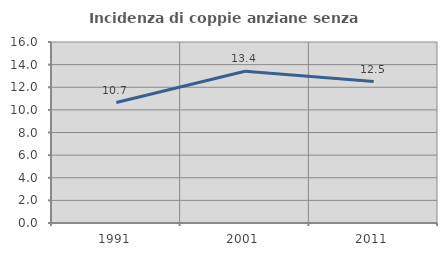
| Category | Incidenza di coppie anziane senza figli  |
|---|---|
| 1991.0 | 10.651 |
| 2001.0 | 13.415 |
| 2011.0 | 12.5 |